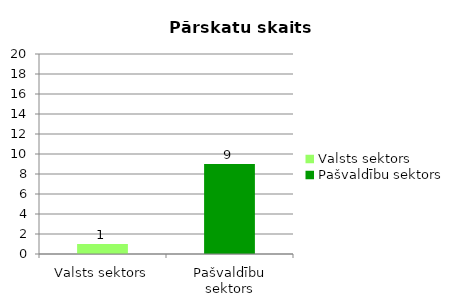
| Category |  Pārskatu skaits |
|---|---|
| Valsts sektors | 1 |
| Pašvaldību sektors | 9 |